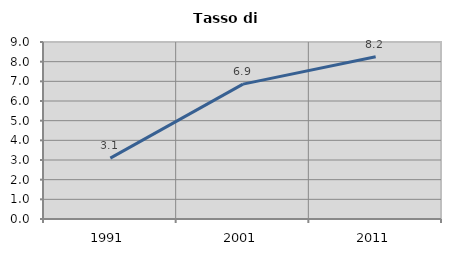
| Category | Tasso di disoccupazione   |
|---|---|
| 1991.0 | 3.093 |
| 2001.0 | 6.857 |
| 2011.0 | 8.247 |